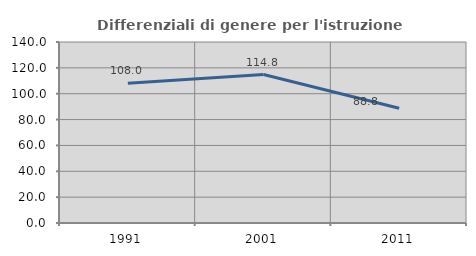
| Category | Differenziali di genere per l'istruzione superiore |
|---|---|
| 1991.0 | 108.048 |
| 2001.0 | 114.837 |
| 2011.0 | 88.815 |